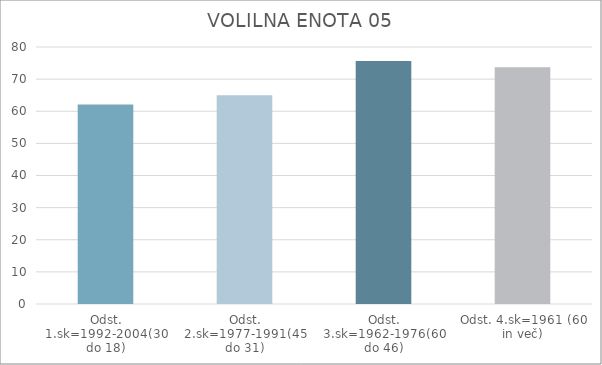
| Category | Series 0 |
|---|---|
| Odst. 1.sk=1992-2004(30 do 18) | 62.14 |
| Odst. 2.sk=1977-1991(45 do 31) | 64.99 |
| Odst. 3.sk=1962-1976(60 do 46) | 75.66 |
| Odst. 4.sk=1961 (60 in več) | 73.69 |